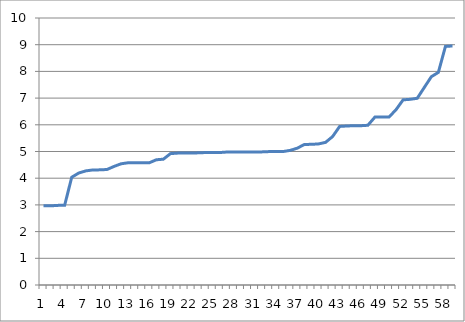
| Category | Series 0 |
|---|---|
| 0 | 2.965 |
| 1 | 2.965 |
| 2 | 2.982 |
| 3 | 2.99 |
| 4 | 4.036 |
| 5 | 4.194 |
| 6 | 4.274 |
| 7 | 4.309 |
| 8 | 4.312 |
| 9 | 4.326 |
| 10 | 4.441 |
| 11 | 4.539 |
| 12 | 4.578 |
| 13 | 4.578 |
| 14 | 4.578 |
| 15 | 4.578 |
| 16 | 4.69 |
| 17 | 4.712 |
| 18 | 4.92 |
| 19 | 4.939 |
| 20 | 4.939 |
| 21 | 4.942 |
| 22 | 4.95 |
| 23 | 4.961 |
| 24 | 4.961 |
| 25 | 4.961 |
| 26 | 4.98 |
| 27 | 4.98 |
| 28 | 4.98 |
| 29 | 4.98 |
| 30 | 4.98 |
| 31 | 4.986 |
| 32 | 4.997 |
| 33 | 4.997 |
| 34 | 4.999 |
| 35 | 5.043 |
| 36 | 5.125 |
| 37 | 5.265 |
| 38 | 5.268 |
| 39 | 5.284 |
| 40 | 5.342 |
| 41 | 5.561 |
| 42 | 5.939 |
| 43 | 5.955 |
| 44 | 5.966 |
| 45 | 5.966 |
| 46 | 5.982 |
| 47 | 6.289 |
| 48 | 6.289 |
| 49 | 6.289 |
| 50 | 6.568 |
| 51 | 6.935 |
| 52 | 6.954 |
| 53 | 6.993 |
| 54 | 7.398 |
| 55 | 7.8 |
| 56 | 7.965 |
| 57 | 8.934 |
| 58 | 8.953 |